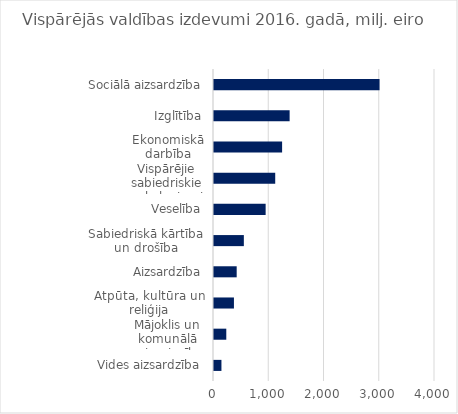
| Category | 2016 |
|---|---|
| Vides aizsardzība | 134.7 |
| Mājoklis un komunālā saimniecība | 222.5 |
| Atpūta, kultūra un reliģija | 360.9 |
| Aizsardzība | 410.6 |
| Sabiedriskā kārtība un drošība | 540.2 |
| Veselība | 934.7 |
| Vispārējie sabiedriskie pakalpojumi | 1108.1 |
| Ekonomiskā darbība | 1232.7 |
| Izglītība | 1368.8 |
| Sociālā aizsardzība | 2996.5 |